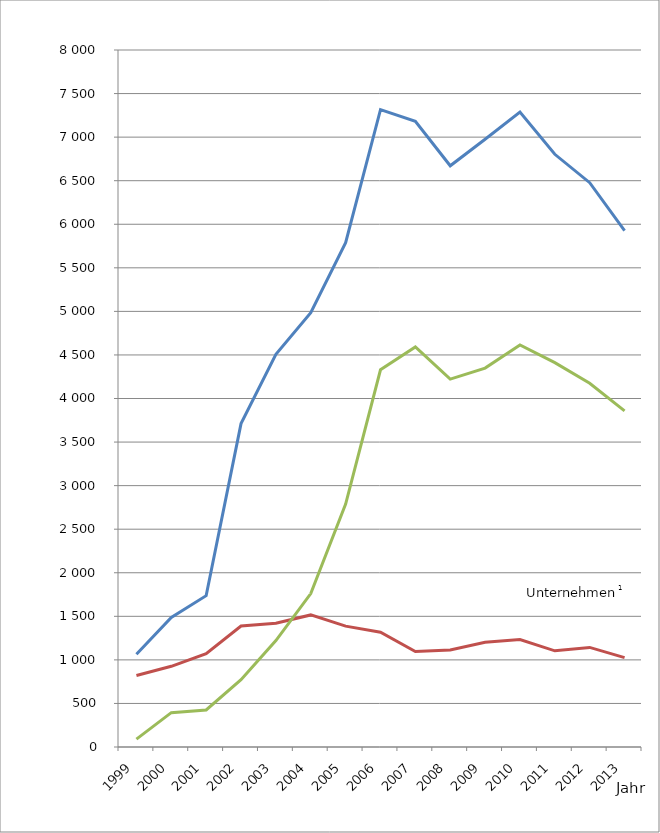
| Category | Verfahren
Insgesamt | von Unternehmen1 | von Verbrauchern |
|---|---|---|---|
| 1999.0 | 1064 | 820 | 91 |
| 2000.0 | 1488 | 926 | 394 |
| 2001.0 | 1737 | 1072 | 425 |
| 2002.0 | 3712 | 1388 | 772 |
| 2003.0 | 4507 | 1420 | 1222 |
| 2004.0 | 4984 | 1516 | 1761 |
| 2005.0 | 5788 | 1387 | 2788 |
| 2006.0 | 7315 | 1317 | 4330 |
| 2007.0 | 7181 | 1095 | 4592 |
| 2008.0 | 6671 | 1114 | 4223 |
| 2009.0 | 6976 | 1203 | 4349 |
| 2010.0 | 7287 | 1233 | 4615 |
| 2011.0 | 6803 | 1104 | 4412 |
| 2012.0 | 6477 | 1143 | 4175 |
| 2013.0 | 5928 | 1026 | 3858 |